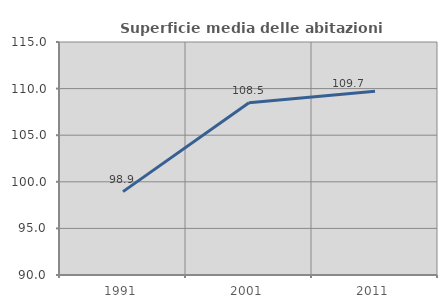
| Category | Superficie media delle abitazioni occupate |
|---|---|
| 1991.0 | 98.948 |
| 2001.0 | 108.475 |
| 2011.0 | 109.722 |